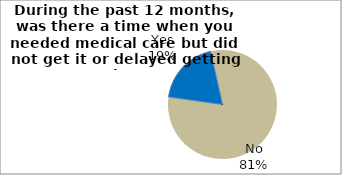
| Category | Series 0 |
|---|---|
| Yes | 19.273 |
| No | 80.727 |